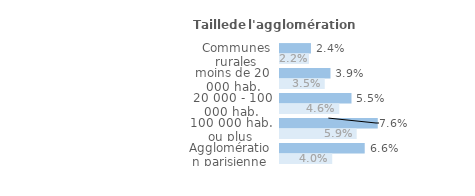
| Category | Series 1 | Series 0 |
|---|---|---|
| Communes rurales | 0.024 | 0.022 |
| moins de 20 000 hab. | 0.039 | 0.035 |
| 20 000 - 100 000 hab. | 0.055 | 0.046 |
| 100 000 hab. ou plus | 0.076 | 0.059 |
| Agglomération parisienne | 0.066 | 0.04 |